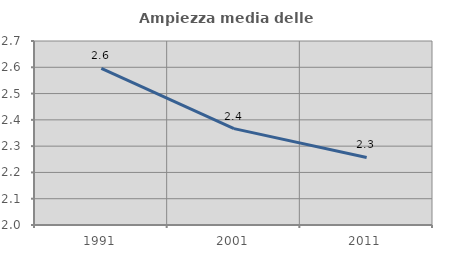
| Category | Ampiezza media delle famiglie |
|---|---|
| 1991.0 | 2.595 |
| 2001.0 | 2.367 |
| 2011.0 | 2.257 |